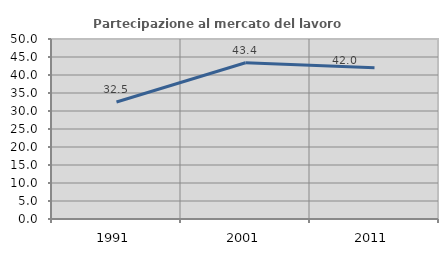
| Category | Partecipazione al mercato del lavoro  femminile |
|---|---|
| 1991.0 | 32.491 |
| 2001.0 | 43.403 |
| 2011.0 | 42.023 |